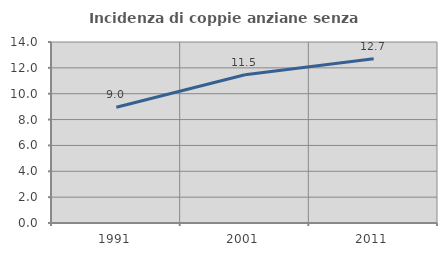
| Category | Incidenza di coppie anziane senza figli  |
|---|---|
| 1991.0 | 8.956 |
| 2001.0 | 11.472 |
| 2011.0 | 12.705 |